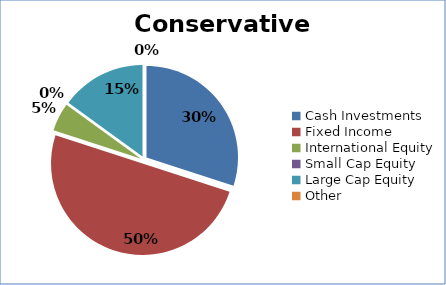
| Category | Series 0 |
|---|---|
| Cash Investments | 0.3 |
| Fixed Income | 0.5 |
| International Equity | 0.05 |
| Small Cap Equity | 0 |
| Large Cap Equity | 0.15 |
| Other | 0 |